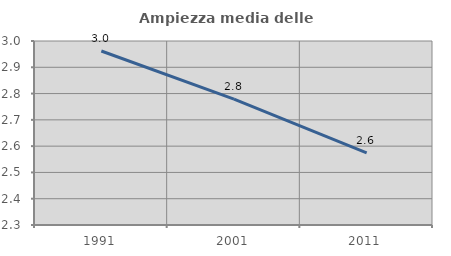
| Category | Ampiezza media delle famiglie |
|---|---|
| 1991.0 | 2.962 |
| 2001.0 | 2.779 |
| 2011.0 | 2.575 |